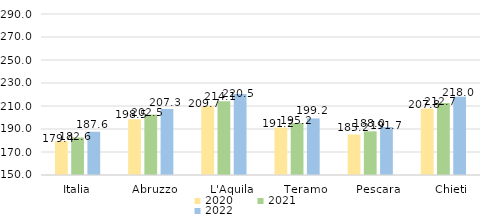
| Category | 2020 | 2021 | 2022 |
|---|---|---|---|
| Italia | 179.4 | 182.6 | 187.6 |
|   Abruzzo | 198.5 | 202.5 | 207.3 |
|     L'Aquila | 209.7 | 214.1 | 220.5 |
|     Teramo | 191.2 | 195.2 | 199.2 |
|     Pescara | 185.2 | 188 | 191.7 |
|     Chieti | 207.8 | 212.7 | 218 |